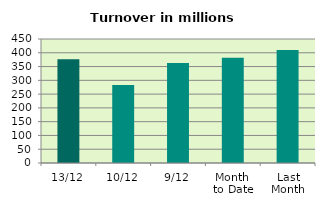
| Category | Series 0 |
|---|---|
| 13/12 | 376.133 |
| 10/12 | 282.619 |
| 9/12 | 362.597 |
| Month 
to Date | 381.675 |
| Last
Month | 410.338 |